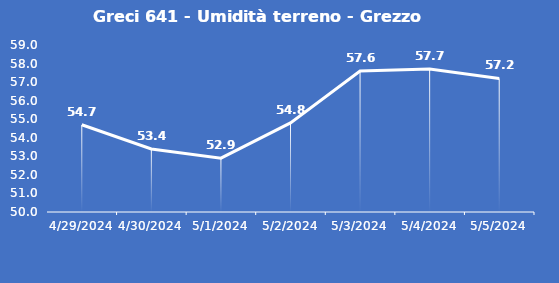
| Category | Greci 641 - Umidità terreno - Grezzo (%VWC) |
|---|---|
| 4/29/24 | 54.7 |
| 4/30/24 | 53.4 |
| 5/1/24 | 52.9 |
| 5/2/24 | 54.8 |
| 5/3/24 | 57.6 |
| 5/4/24 | 57.7 |
| 5/5/24 | 57.2 |